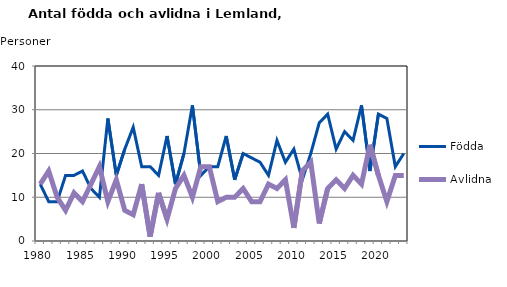
| Category | Födda | Avlidna |
|---|---|---|
| 1980.0 | 13 | 13 |
| 1981.0 | 9 | 16 |
| 1982.0 | 9 | 10 |
| 1983.0 | 15 | 7 |
| 1984.0 | 15 | 11 |
| 1985.0 | 16 | 9 |
| 1986.0 | 12 | 13 |
| 1987.0 | 10 | 17 |
| 1988.0 | 28 | 9 |
| 1989.0 | 15 | 14 |
| 1990.0 | 21 | 7 |
| 1991.0 | 26 | 6 |
| 1992.0 | 17 | 13 |
| 1993.0 | 17 | 1 |
| 1994.0 | 15 | 11 |
| 1995.0 | 24 | 5 |
| 1996.0 | 13 | 12 |
| 1997.0 | 20 | 15 |
| 1998.0 | 31 | 10 |
| 1999.0 | 15 | 17 |
| 2000.0 | 17 | 17 |
| 2001.0 | 17 | 9 |
| 2002.0 | 24 | 10 |
| 2003.0 | 14 | 10 |
| 2004.0 | 20 | 12 |
| 2005.0 | 19 | 9 |
| 2006.0 | 18 | 9 |
| 2007.0 | 15 | 13 |
| 2008.0 | 23 | 12 |
| 2009.0 | 18 | 14 |
| 2010.0 | 21 | 3 |
| 2011.0 | 14 | 16 |
| 2012.0 | 20 | 18 |
| 2013.0 | 27 | 4 |
| 2014.0 | 29 | 12 |
| 2015.0 | 21 | 14 |
| 2016.0 | 25 | 12 |
| 2017.0 | 23 | 15 |
| 2018.0 | 31 | 13 |
| 2019.0 | 16 | 22 |
| 2020.0 | 29 | 15 |
| 2021.0 | 28 | 9 |
| 2022.0 | 17 | 15 |
| 2023.0 | 20 | 15 |